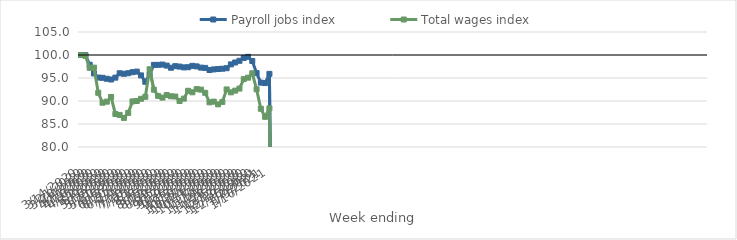
| Category | Payroll jobs index | Total wages index |
|---|---|---|
| 14/03/2020 | 100 | 100 |
| 21/03/2020 | 99.952 | 99.812 |
| 28/03/2020 | 97.879 | 97.212 |
| 04/04/2020 | 95.996 | 97.254 |
| 11/04/2020 | 95.093 | 91.784 |
| 18/04/2020 | 95.042 | 89.63 |
| 25/04/2020 | 94.837 | 89.859 |
| 02/05/2020 | 94.677 | 90.875 |
| 09/05/2020 | 95.077 | 87.178 |
| 16/05/2020 | 96.028 | 86.971 |
| 23/05/2020 | 95.912 | 86.319 |
| 30/05/2020 | 96.039 | 87.413 |
| 06/06/2020 | 96.262 | 89.911 |
| 13/06/2020 | 96.392 | 89.999 |
| 20/06/2020 | 95.565 | 90.472 |
| 27/06/2020 | 94.178 | 90.909 |
| 04/07/2020 | 95.744 | 96.9 |
| 11/07/2020 | 97.849 | 92.462 |
| 18/07/2020 | 97.857 | 91.098 |
| 25/07/2020 | 97.92 | 90.738 |
| 01/08/2020 | 97.698 | 91.301 |
| 08/08/2020 | 97.235 | 91.028 |
| 15/08/2020 | 97.571 | 90.974 |
| 22/08/2020 | 97.478 | 89.996 |
| 29/08/2020 | 97.306 | 90.514 |
| 05/09/2020 | 97.346 | 92.22 |
| 12/09/2020 | 97.643 | 91.891 |
| 19/09/2020 | 97.523 | 92.588 |
| 26/09/2020 | 97.258 | 92.476 |
| 03/10/2020 | 97.196 | 91.778 |
| 10/10/2020 | 96.742 | 89.714 |
| 17/10/2020 | 96.868 | 89.864 |
| 24/10/2020 | 96.95 | 89.269 |
| 31/10/2020 | 97.018 | 89.802 |
| 07/11/2020 | 97.126 | 92.512 |
| 14/11/2020 | 97.962 | 91.881 |
| 21/11/2020 | 98.372 | 92.254 |
| 28/11/2020 | 98.74 | 92.701 |
| 05/12/2020 | 99.354 | 94.746 |
| 12/12/2020 | 99.6 | 95.069 |
| 19/12/2020 | 98.698 | 96.023 |
| 26/12/2020 | 96.063 | 92.554 |
| 02/01/2021 | 93.99 | 88.31 |
| 09/01/2021 | 93.894 | 86.564 |
| 16/01/2021 | 95.897 | 88.398 |